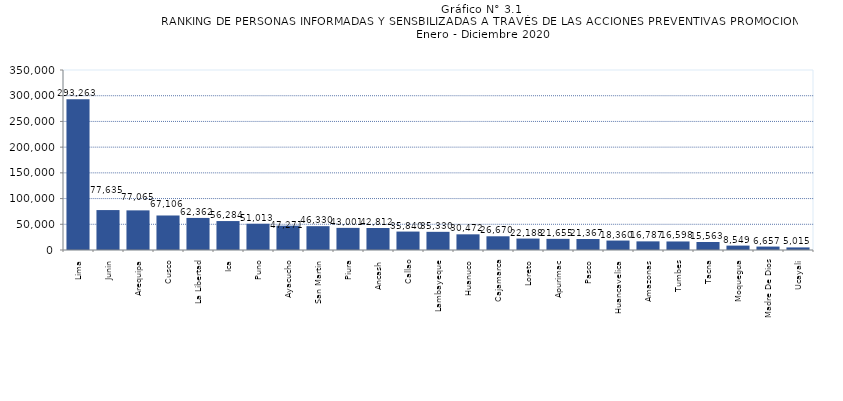
| Category | Series 0 |
|---|---|
| Lima | 293263 |
| Junin | 77635 |
| Arequipa | 77065 |
| Cusco | 67106 |
| La Libertad | 62362 |
| Ica | 56284 |
| Puno | 51013 |
| Ayacucho | 47271 |
| San Martin | 46330 |
| Piura | 43001 |
| Ancash | 42812 |
| Callao | 35840 |
| Lambayeque | 35330 |
| Huanuco | 30472 |
| Cajamarca | 26670 |
| Loreto | 22188 |
| Apurimac | 21655 |
| Pasco | 21367 |
| Huancavelica | 18360 |
| Amazonas | 16787 |
| Tumbes | 16598 |
| Tacna | 15563 |
| Moquegua | 8549 |
| Madre De Dios | 6657 |
| Ucayali | 5015 |